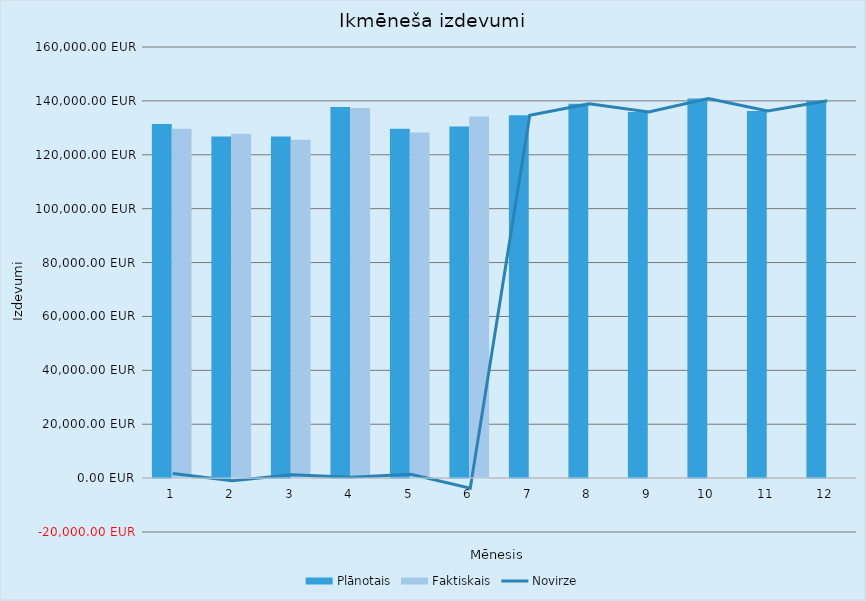
| Category | Plānotais | Faktiskais |
|---|---|---|
| 0 | 131420 | 129682 |
| 1 | 126820 | 127804 |
| 2 | 126820 | 125565 |
| 3 | 137695 | 137394 |
| 4 | 129695 | 128255 |
| 5 | 130495 | 134239 |
| 6 | 134695 | 0 |
| 7 | 138918 | 0 |
| 8 | 135918 | 0 |
| 9 | 140918 | 0 |
| 10 | 136218 | 0 |
| 11 | 140018 | 0 |